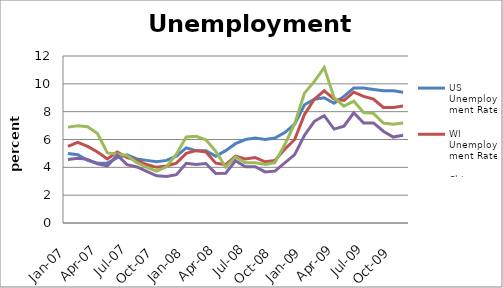
| Category | US Unemployment Rate | WI Unemployment Rate | Chippewa Unemployment Rate | EC Unemployment Rate |
|---|---|---|---|---|
| 2007-01-01 | 5 | 5.5 | 6.889 | 4.571 |
| 2007-02-01 | 4.9 | 5.8 | 6.984 | 4.644 |
| 2007-03-01 | 4.5 | 5.5 | 6.915 | 4.573 |
| 2007-04-01 | 4.3 | 5.1 | 6.427 | 4.247 |
| 2007-05-01 | 4.3 | 4.6 | 5.034 | 4.099 |
| 2007-06-01 | 4.7 | 5.1 | 4.963 | 4.87 |
| 2007-07-01 | 4.9 | 4.7 | 4.855 | 4.192 |
| 2007-08-01 | 4.6 | 4.5 | 4.335 | 4.029 |
| 2007-09-01 | 4.5 | 4.2 | 3.994 | 3.717 |
| 2007-10-02 | 4.4 | 4 | 3.722 | 3.392 |
| 2007-11-01 | 4.5 | 4.1 | 4.04 | 3.341 |
| 2007-12-01 | 4.8 | 4.3 | 4.949 | 3.468 |
| 2008-01-01 | 5.4 | 5 | 6.184 | 4.288 |
| 2008-02-01 | 5.2 | 5.2 | 6.233 | 4.199 |
| 2008-03-01 | 5.2 | 5.1 | 5.987 | 4.276 |
| 2008-04-01 | 4.8 | 4.3 | 5.151 | 3.558 |
| 2008-05-01 | 5.2 | 4.2 | 4.025 | 3.579 |
| 2008-06-01 | 5.7 | 4.8 | 4.75 | 4.474 |
| 2008-07-01 | 6 | 4.6 | 4.325 | 4.046 |
| 2008-08-01 | 6.1 | 4.7 | 4.333 | 4.045 |
| 2008-09-01 | 6 | 4.4 | 4.202 | 3.673 |
| 2008-10-01 | 6.1 | 4.5 | 4.343 | 3.725 |
| 2008-11-01 | 6.5 | 5.3 | 5.641 | 4.319 |
| 2008-12-01 | 7.1 | 6 | 7.135 | 4.911 |
| 2009-01-09 | 8.5 | 7.8 | 9.331 | 6.307 |
| 2009-02-09 | 8.9 | 8.9 | 10.175 | 7.308 |
| 2009-03-09 | 9 | 9.5 | 11.165 | 7.715 |
| 2009-04-09 | 8.6 | 8.9 | 9.006 | 6.747 |
| 2009-05-09 | 9.1 | 8.8 | 8.398 | 6.959 |
| 2009-06-09 | 9.7 | 9.4 | 8.752 | 7.923 |
| 2009-07-09 | 9.7 | 9.1 | 7.939 | 7.18 |
| 2009-08-09 | 9.6 | 8.9 | 7.879 | 7.192 |
| 2009-09-09 | 9.5 | 8.3 | 7.183 | 6.597 |
| 2009-10-09 | 9.5 | 8.3 | 7.088 | 6.174 |
| 2009-11-09 | 9.4 | 8.4 | 7.182 | 6.31 |